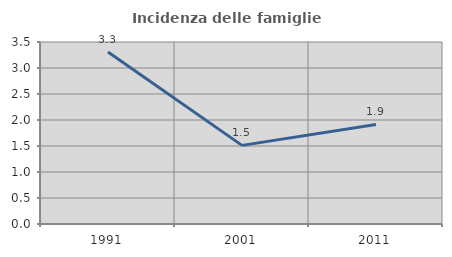
| Category | Incidenza delle famiglie numerose |
|---|---|
| 1991.0 | 3.309 |
| 2001.0 | 1.512 |
| 2011.0 | 1.915 |